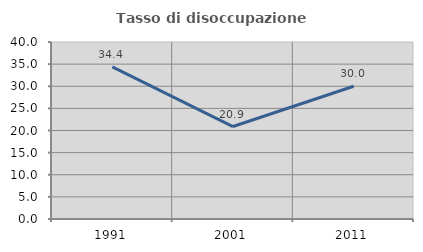
| Category | Tasso di disoccupazione giovanile  |
|---|---|
| 1991.0 | 34.375 |
| 2001.0 | 20.896 |
| 2011.0 | 30 |